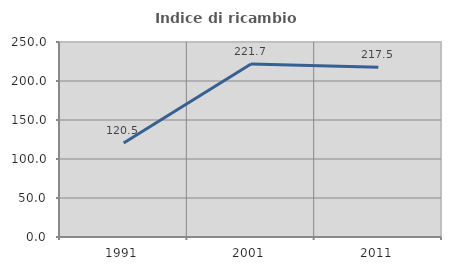
| Category | Indice di ricambio occupazionale  |
|---|---|
| 1991.0 | 120.548 |
| 2001.0 | 221.739 |
| 2011.0 | 217.544 |